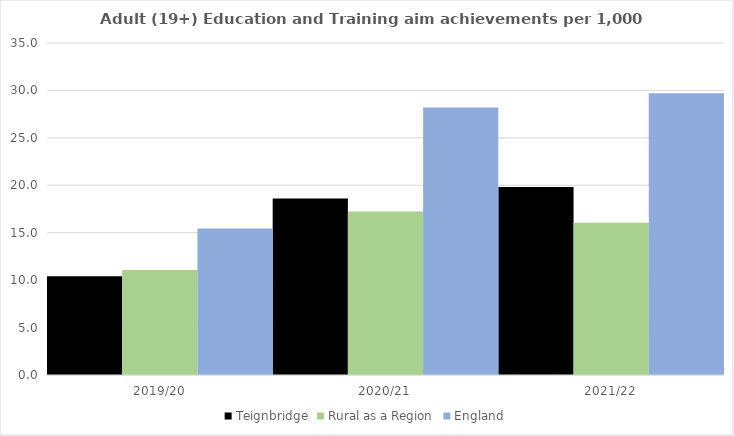
| Category | Teignbridge | Rural as a Region | England |
|---|---|---|---|
| 2019/20 | 10.417 | 11.081 | 15.446 |
| 2020/21 | 18.596 | 17.224 | 28.211 |
| 2021/22 | 19.818 | 16.063 | 29.711 |